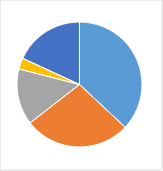
| Category | Series 0 |
|---|---|
| 0 | 0.37 |
| 1 | 0.275 |
| 2 | 0.145 |
| 3 | 0.029 |
| 4 | 0.181 |